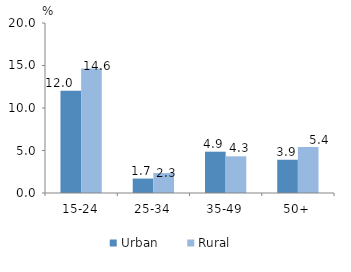
| Category | Urban | Rural |
|---|---|---|
| 15-24 | 12.027 | 14.637 |
| 25-34 | 1.701 | 2.346 |
| 35-49 | 4.86 | 4.314 |
| 50+ | 3.912 | 5.4 |